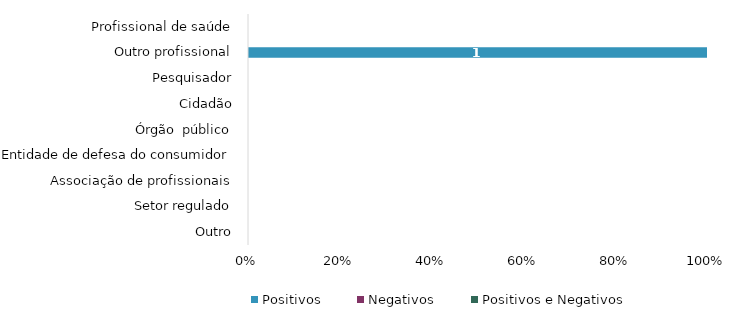
| Category | Positivos | Negativos | Positivos e Negativos |
|---|---|---|---|
| Outro | 0 | 0 | 0 |
| Setor regulado | 0 | 0 | 0 |
| Associação de profissionais | 0 | 0 | 0 |
| Entidade de defesa do consumidor | 0 | 0 | 0 |
| Órgão  público | 0 | 0 | 0 |
| Cidadão | 0 | 0 | 0 |
| Pesquisador | 0 | 0 | 0 |
| Outro profissional | 1 | 0 | 0 |
| Profissional de saúde | 0 | 0 | 0 |